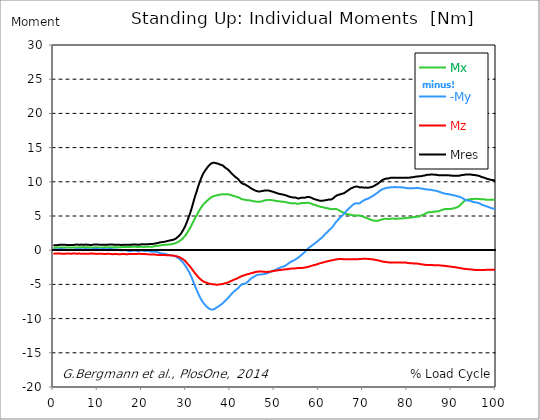
| Category |  Mx |  -My |  Mz |  Mres |
|---|---|---|---|---|
| 0.0 | 0.37 | 0.1 | -0.51 | 0.75 |
| 0.167348456675344 | 0.36 | 0.09 | -0.5 | 0.74 |
| 0.334696913350688 | 0.36 | 0.08 | -0.5 | 0.73 |
| 0.5020453700260321 | 0.36 | 0.09 | -0.49 | 0.73 |
| 0.669393826701376 | 0.37 | 0.1 | -0.48 | 0.73 |
| 0.83674228337672 | 0.38 | 0.12 | -0.48 | 0.74 |
| 1.0040907400520642 | 0.38 | 0.12 | -0.49 | 0.75 |
| 1.1621420602454444 | 0.39 | 0.12 | -0.48 | 0.76 |
| 1.3294905169207885 | 0.4 | 0.14 | -0.48 | 0.78 |
| 1.4968389735961325 | 0.4 | 0.15 | -0.49 | 0.79 |
| 1.6641874302714765 | 0.4 | 0.17 | -0.5 | 0.8 |
| 1.8315358869468206 | 0.4 | 0.16 | -0.51 | 0.81 |
| 1.9988843436221646 | 0.4 | 0.15 | -0.51 | 0.81 |
| 2.1662328002975086 | 0.4 | 0.15 | -0.51 | 0.81 |
| 2.333581256972853 | 0.4 | 0.15 | -0.51 | 0.8 |
| 2.5009297136481967 | 0.4 | 0.13 | -0.52 | 0.8 |
| 2.6682781703235405 | 0.39 | 0.1 | -0.52 | 0.79 |
| 2.8356266269988843 | 0.39 | 0.07 | -0.51 | 0.78 |
| 3.002975083674229 | 0.39 | 0.06 | -0.5 | 0.77 |
| 3.1703235403495724 | 0.39 | 0.06 | -0.49 | 0.76 |
| 3.337671997024917 | 0.39 | 0.07 | -0.49 | 0.75 |
| 3.4957233172182973 | 0.39 | 0.07 | -0.49 | 0.76 |
| 3.663071773893641 | 0.39 | 0.08 | -0.5 | 0.76 |
| 3.8304202305689854 | 0.39 | 0.07 | -0.51 | 0.77 |
| 3.997768687244329 | 0.38 | 0.06 | -0.51 | 0.77 |
| 4.165117143919673 | 0.38 | 0.04 | -0.5 | 0.77 |
| 4.332465600595017 | 0.38 | 0.04 | -0.49 | 0.76 |
| 4.499814057270361 | 0.39 | 0.05 | -0.48 | 0.77 |
| 4.667162513945706 | 0.4 | 0.08 | -0.48 | 0.78 |
| 4.834510970621049 | 0.41 | 0.12 | -0.48 | 0.8 |
| 5.001859427296393 | 0.41 | 0.14 | -0.49 | 0.81 |
| 5.169207883971737 | 0.41 | 0.14 | -0.5 | 0.82 |
| 5.336556340647081 | 0.41 | 0.13 | -0.51 | 0.82 |
| 5.503904797322425 | 0.41 | 0.13 | -0.51 | 0.82 |
| 5.671253253997769 | 0.41 | 0.12 | -0.5 | 0.81 |
| 5.82930457419115 | 0.41 | 0.13 | -0.5 | 0.8 |
| 5.996653030866494 | 0.42 | 0.16 | -0.5 | 0.81 |
| 6.164001487541838 | 0.43 | 0.17 | -0.51 | 0.82 |
| 6.331349944217181 | 0.43 | 0.15 | -0.52 | 0.82 |
| 6.498698400892526 | 0.42 | 0.12 | -0.52 | 0.81 |
| 6.66604685756787 | 0.42 | 0.11 | -0.51 | 0.8 |
| 6.833395314243213 | 0.42 | 0.12 | -0.5 | 0.8 |
| 7.000743770918558 | 0.43 | 0.14 | -0.5 | 0.8 |
| 7.168092227593902 | 0.43 | 0.17 | -0.5 | 0.81 |
| 7.335440684269246 | 0.43 | 0.18 | -0.51 | 0.82 |
| 7.50278914094459 | 0.43 | 0.18 | -0.52 | 0.82 |
| 7.6701375976199335 | 0.42 | 0.15 | -0.52 | 0.81 |
| 7.837486054295278 | 0.42 | 0.13 | -0.52 | 0.79 |
| 7.995537374488658 | 0.41 | 0.12 | -0.52 | 0.79 |
| 8.162885831164003 | 0.4 | 0.11 | -0.51 | 0.77 |
| 8.330234287839346 | 0.4 | 0.1 | -0.5 | 0.76 |
| 8.49758274451469 | 0.4 | 0.12 | -0.5 | 0.77 |
| 8.664931201190035 | 0.4 | 0.14 | -0.49 | 0.77 |
| 8.832279657865378 | 0.4 | 0.15 | -0.5 | 0.79 |
| 8.999628114540721 | 0.4 | 0.17 | -0.5 | 0.81 |
| 9.166976571216066 | 0.41 | 0.2 | -0.5 | 0.82 |
| 9.334325027891412 | 0.41 | 0.22 | -0.51 | 0.84 |
| 9.501673484566755 | 0.41 | 0.22 | -0.52 | 0.85 |
| 9.669021941242098 | 0.42 | 0.22 | -0.52 | 0.85 |
| 9.836370397917442 | 0.42 | 0.21 | -0.53 | 0.85 |
| 10.003718854592787 | 0.41 | 0.18 | -0.54 | 0.84 |
| 10.17106731126813 | 0.4 | 0.15 | -0.53 | 0.82 |
| 10.329118631461512 | 0.39 | 0.13 | -0.53 | 0.8 |
| 10.496467088136853 | 0.39 | 0.13 | -0.52 | 0.79 |
| 10.663815544812199 | 0.4 | 0.14 | -0.52 | 0.78 |
| 10.831164001487544 | 0.4 | 0.15 | -0.52 | 0.79 |
| 10.998512458162887 | 0.41 | 0.17 | -0.53 | 0.8 |
| 11.16586091483823 | 0.41 | 0.17 | -0.53 | 0.81 |
| 11.333209371513574 | 0.41 | 0.17 | -0.54 | 0.81 |
| 11.50055782818892 | 0.42 | 0.16 | -0.54 | 0.81 |
| 11.667906284864264 | 0.42 | 0.16 | -0.54 | 0.81 |
| 11.835254741539607 | 0.42 | 0.15 | -0.54 | 0.81 |
| 12.00260319821495 | 0.41 | 0.14 | -0.54 | 0.8 |
| 12.169951654890292 | 0.41 | 0.14 | -0.53 | 0.8 |
| 12.337300111565641 | 0.42 | 0.16 | -0.52 | 0.8 |
| 12.504648568240984 | 0.43 | 0.18 | -0.53 | 0.82 |
| 12.662699888434362 | 0.44 | 0.2 | -0.53 | 0.83 |
| 12.830048345109708 | 0.44 | 0.21 | -0.55 | 0.84 |
| 12.997396801785053 | 0.44 | 0.2 | -0.56 | 0.85 |
| 13.164745258460396 | 0.44 | 0.18 | -0.57 | 0.85 |
| 13.33209371513574 | 0.43 | 0.15 | -0.58 | 0.84 |
| 13.499442171811083 | 0.42 | 0.11 | -0.58 | 0.82 |
| 13.666790628486426 | 0.42 | 0.09 | -0.57 | 0.8 |
| 13.834139085161771 | 0.42 | 0.09 | -0.57 | 0.79 |
| 14.001487541837117 | 0.42 | 0.09 | -0.56 | 0.78 |
| 14.16883599851246 | 0.43 | 0.09 | -0.57 | 0.78 |
| 14.336184455187803 | 0.43 | 0.09 | -0.57 | 0.79 |
| 14.503532911863147 | 0.44 | 0.07 | -0.58 | 0.79 |
| 14.670881368538492 | 0.44 | 0.05 | -0.58 | 0.79 |
| 14.828932688731873 | 0.44 | 0.03 | -0.58 | 0.79 |
| 14.996281145407215 | 0.44 | 0.01 | -0.59 | 0.79 |
| 15.163629602082558 | 0.44 | -0.01 | -0.58 | 0.78 |
| 15.330978058757903 | 0.44 | -0.03 | -0.57 | 0.77 |
| 15.498326515433247 | 0.45 | -0.03 | -0.56 | 0.77 |
| 15.665674972108594 | 0.46 | -0.02 | -0.55 | 0.78 |
| 15.833023428783937 | 0.47 | 0 | -0.55 | 0.79 |
| 16.00037188545928 | 0.48 | 0.02 | -0.56 | 0.8 |
| 16.167720342134626 | 0.47 | 0.01 | -0.57 | 0.81 |
| 16.335068798809967 | 0.47 | -0.01 | -0.58 | 0.81 |
| 16.502417255485312 | 0.46 | -0.04 | -0.58 | 0.81 |
| 16.669765712160658 | 0.46 | -0.05 | -0.59 | 0.81 |
| 16.837114168836 | 0.46 | -0.09 | -0.58 | 0.81 |
| 17.004462625511344 | 0.46 | -0.12 | -0.57 | 0.8 |
| 17.16251394570472 | 0.46 | -0.14 | -0.56 | 0.8 |
| 17.32986240238007 | 0.46 | -0.15 | -0.55 | 0.8 |
| 17.497210859055414 | 0.47 | -0.13 | -0.54 | 0.8 |
| 17.664559315730756 | 0.49 | -0.1 | -0.54 | 0.81 |
| 17.8319077724061 | 0.5 | -0.07 | -0.54 | 0.82 |
| 17.999256229081443 | 0.51 | -0.04 | -0.54 | 0.83 |
| 18.166604685756788 | 0.51 | -0.04 | -0.55 | 0.83 |
| 18.333953142432133 | 0.51 | -0.05 | -0.56 | 0.84 |
| 18.501301599107478 | 0.5 | -0.07 | -0.56 | 0.84 |
| 18.668650055782823 | 0.49 | -0.1 | -0.56 | 0.83 |
| 18.835998512458165 | 0.48 | -0.12 | -0.55 | 0.82 |
| 19.00334696913351 | 0.47 | -0.14 | -0.54 | 0.81 |
| 19.170695425808855 | 0.47 | -0.14 | -0.52 | 0.81 |
| 19.338043882484197 | 0.48 | -0.12 | -0.52 | 0.81 |
| 19.496095202677576 | 0.48 | -0.09 | -0.52 | 0.82 |
| 19.66344365935292 | 0.49 | -0.06 | -0.53 | 0.83 |
| 19.830792116028263 | 0.49 | -0.04 | -0.54 | 0.84 |
| 19.998140572703612 | 0.49 | -0.05 | -0.55 | 0.86 |
| 20.165489029378953 | 0.49 | -0.06 | -0.57 | 0.86 |
| 20.3328374860543 | 0.48 | -0.08 | -0.57 | 0.86 |
| 20.500185942729644 | 0.48 | -0.1 | -0.57 | 0.85 |
| 20.667534399404985 | 0.48 | -0.12 | -0.57 | 0.85 |
| 20.83488285608033 | 0.48 | -0.11 | -0.57 | 0.85 |
| 21.002231312755672 | 0.49 | -0.1 | -0.58 | 0.86 |
| 21.16957976943102 | 0.49 | -0.09 | -0.59 | 0.87 |
| 21.336928226106362 | 0.49 | -0.09 | -0.6 | 0.87 |
| 21.504276682781704 | 0.49 | -0.11 | -0.61 | 0.88 |
| 21.67162513945705 | 0.49 | -0.14 | -0.61 | 0.89 |
| 21.82967645965043 | 0.5 | -0.16 | -0.62 | 0.91 |
| 21.997024916325774 | 0.5 | -0.19 | -0.62 | 0.91 |
| 22.16437337300112 | 0.5 | -0.21 | -0.62 | 0.91 |
| 22.33172182967646 | 0.51 | -0.23 | -0.61 | 0.91 |
| 22.499070286351806 | 0.53 | -0.22 | -0.62 | 0.92 |
| 22.666418743027148 | 0.55 | -0.22 | -0.62 | 0.94 |
| 22.833767199702496 | 0.57 | -0.21 | -0.62 | 0.96 |
| 23.00111565637784 | 0.59 | -0.21 | -0.63 | 0.97 |
| 23.168464113053183 | 0.61 | -0.21 | -0.65 | 0.99 |
| 23.335812569728528 | 0.62 | -0.23 | -0.67 | 1.02 |
| 23.50316102640387 | 0.64 | -0.26 | -0.68 | 1.04 |
| 23.670509483079215 | 0.65 | -0.31 | -0.69 | 1.06 |
| 23.83785793975456 | 0.67 | -0.37 | -0.7 | 1.09 |
| 23.995909259947936 | 0.69 | -0.4 | -0.7 | 1.12 |
| 24.163257716623285 | 0.71 | -0.44 | -0.71 | 1.15 |
| 24.330606173298627 | 0.72 | -0.46 | -0.71 | 1.16 |
| 24.49795462997397 | 0.73 | -0.47 | -0.71 | 1.18 |
| 24.665303086649313 | 0.75 | -0.49 | -0.71 | 1.2 |
| 24.83265154332466 | 0.75 | -0.5 | -0.71 | 1.21 |
| 25.0 | 0.76 | -0.51 | -0.71 | 1.22 |
| 25.167348456675345 | 0.77 | -0.53 | -0.72 | 1.24 |
| 25.334696913350694 | 0.78 | -0.55 | -0.72 | 1.26 |
| 25.502045370026035 | 0.8 | -0.6 | -0.73 | 1.3 |
| 25.669393826701377 | 0.81 | -0.62 | -0.73 | 1.32 |
| 25.836742283376722 | 0.82 | -0.65 | -0.74 | 1.35 |
| 26.004090740052067 | 0.83 | -0.68 | -0.74 | 1.37 |
| 26.17143919672741 | 0.84 | -0.7 | -0.75 | 1.4 |
| 26.329490516920792 | 0.85 | -0.73 | -0.75 | 1.42 |
| 26.49683897359613 | 0.87 | -0.75 | -0.76 | 1.44 |
| 26.66418743027148 | 0.88 | -0.76 | -0.76 | 1.47 |
| 26.831535886946828 | 0.9 | -0.77 | -0.77 | 1.49 |
| 26.998884343622166 | 0.92 | -0.79 | -0.78 | 1.51 |
| 27.166232800297514 | 0.94 | -0.81 | -0.8 | 1.54 |
| 27.333581256972852 | 0.97 | -0.83 | -0.82 | 1.58 |
| 27.5009297136482 | 0.99 | -0.85 | -0.83 | 1.62 |
| 27.668278170323543 | 1.04 | -0.91 | -0.86 | 1.69 |
| 27.835626626998888 | 1.1 | -0.99 | -0.89 | 1.78 |
| 28.002975083674233 | 1.15 | -1.07 | -0.91 | 1.87 |
| 28.170323540349575 | 1.2 | -1.14 | -0.95 | 1.96 |
| 28.33767199702492 | 1.25 | -1.2 | -0.98 | 2.04 |
| 28.50502045370026 | 1.32 | -1.28 | -1.02 | 2.15 |
| 28.663071773893645 | 1.4 | -1.36 | -1.07 | 2.27 |
| 28.830420230568986 | 1.47 | -1.46 | -1.13 | 2.41 |
| 28.99776868724433 | 1.57 | -1.58 | -1.19 | 2.57 |
| 29.165117143919673 | 1.67 | -1.71 | -1.27 | 2.76 |
| 29.33246560059502 | 1.78 | -1.83 | -1.33 | 2.94 |
| 29.499814057270367 | 1.89 | -1.97 | -1.41 | 3.13 |
| 29.66716251394571 | 2.01 | -2.11 | -1.5 | 3.34 |
| 29.834510970621054 | 2.15 | -2.26 | -1.6 | 3.56 |
| 30.00185942729639 | 2.3 | -2.43 | -1.72 | 3.82 |
| 30.169207883971744 | 2.46 | -2.6 | -1.83 | 4.08 |
| 30.33655634064708 | 2.64 | -2.8 | -1.97 | 4.38 |
| 30.50390479732243 | 2.82 | -2.97 | -2.09 | 4.66 |
| 30.671253253997772 | 2.99 | -3.16 | -2.21 | 4.96 |
| 30.829304574191156 | 3.17 | -3.36 | -2.34 | 5.25 |
| 30.996653030866494 | 3.35 | -3.61 | -2.47 | 5.58 |
| 31.164001487541842 | 3.55 | -3.83 | -2.61 | 5.91 |
| 31.331349944217187 | 3.76 | -4.09 | -2.75 | 6.27 |
| 31.498698400892525 | 3.99 | -4.37 | -2.9 | 6.66 |
| 31.666046857567874 | 4.21 | -4.65 | -3.05 | 7.04 |
| 31.833395314243212 | 4.44 | -4.93 | -3.2 | 7.43 |
| 32.00074377091856 | 4.64 | -5.19 | -3.35 | 7.79 |
| 32.1680922275939 | 4.85 | -5.47 | -3.48 | 8.15 |
| 32.33544068426925 | 5 | -5.69 | -3.59 | 8.44 |
| 32.50278914094459 | 5.22 | -5.94 | -3.72 | 8.8 |
| 32.670137597619934 | 5.44 | -6.2 | -3.86 | 9.16 |
| 32.83748605429528 | 5.63 | -6.45 | -3.98 | 9.5 |
| 33.004834510970625 | 5.81 | -6.67 | -4.09 | 9.8 |
| 33.162885831164004 | 5.98 | -6.89 | -4.18 | 10.09 |
| 33.33023428783935 | 6.16 | -7.11 | -4.28 | 10.38 |
| 33.497582744514695 | 6.31 | -7.28 | -4.36 | 10.63 |
| 33.664931201190036 | 6.48 | -7.46 | -4.45 | 10.89 |
| 33.83227965786538 | 6.64 | -7.62 | -4.53 | 11.13 |
| 33.99962811454073 | 6.76 | -7.76 | -4.59 | 11.33 |
| 34.16697657121607 | 6.86 | -7.9 | -4.64 | 11.49 |
| 34.33432502789141 | 6.96 | -8.02 | -4.68 | 11.65 |
| 34.50167348456676 | 7.06 | -8.14 | -4.72 | 11.81 |
| 34.6690219412421 | 7.16 | -8.25 | -4.77 | 11.97 |
| 34.83637039791744 | 7.27 | -8.35 | -4.8 | 12.11 |
| 35.00371885459279 | 7.36 | -8.44 | -4.84 | 12.25 |
| 35.17106731126814 | 7.46 | -8.52 | -4.87 | 12.37 |
| 35.338415767943474 | 7.55 | -8.58 | -4.9 | 12.48 |
| 35.49646708813686 | 7.63 | -8.63 | -4.93 | 12.58 |
| 35.6638155448122 | 7.71 | -8.67 | -4.95 | 12.66 |
| 35.831164001487544 | 7.78 | -8.69 | -4.97 | 12.73 |
| 35.998512458162885 | 7.83 | -8.69 | -4.98 | 12.76 |
| 36.165860914838234 | 7.88 | -8.66 | -4.99 | 12.77 |
| 36.333209371513576 | 7.93 | -8.64 | -5 | 12.79 |
| 36.50055782818892 | 7.96 | -8.59 | -5 | 12.78 |
| 36.667906284864266 | 7.98 | -8.51 | -5.03 | 12.75 |
| 36.83525474153961 | 8 | -8.41 | -5.04 | 12.71 |
| 37.002603198214956 | 8.03 | -8.34 | -5.04 | 12.68 |
| 37.1699516548903 | 8.06 | -8.29 | -5.04 | 12.67 |
| 37.337300111565646 | 8.09 | -8.22 | -5.03 | 12.64 |
| 37.50464856824098 | 8.11 | -8.15 | -5.02 | 12.6 |
| 37.66269988843437 | 8.11 | -8.05 | -4.99 | 12.52 |
| 37.83004834510971 | 8.13 | -7.96 | -4.97 | 12.47 |
| 37.99739680178505 | 8.16 | -7.9 | -4.97 | 12.46 |
| 38.16474525846039 | 8.19 | -7.85 | -4.95 | 12.44 |
| 38.33209371513574 | 8.19 | -7.77 | -4.93 | 12.38 |
| 38.49944217181109 | 8.17 | -7.62 | -4.89 | 12.26 |
| 38.666790628486424 | 8.16 | -7.51 | -4.86 | 12.17 |
| 38.83413908516178 | 8.16 | -7.4 | -4.83 | 12.08 |
| 39.001487541837115 | 8.16 | -7.29 | -4.8 | 12 |
| 39.16883599851246 | 8.17 | -7.19 | -4.77 | 11.93 |
| 39.336184455187805 | 8.17 | -7.08 | -4.75 | 11.86 |
| 39.503532911863154 | 8.18 | -6.97 | -4.72 | 11.79 |
| 39.670881368538495 | 8.16 | -6.85 | -4.67 | 11.68 |
| 39.83822982521384 | 8.11 | -6.74 | -4.61 | 11.55 |
| 39.996281145407224 | 8.08 | -6.61 | -4.56 | 11.43 |
| 40.163629602082565 | 8.05 | -6.47 | -4.51 | 11.31 |
| 40.33097805875791 | 8.02 | -6.36 | -4.46 | 11.2 |
| 40.498326515433256 | 7.99 | -6.25 | -4.41 | 11.1 |
| 40.6656749721086 | 7.95 | -6.15 | -4.36 | 10.99 |
| 40.83302342878393 | 7.92 | -6.05 | -4.32 | 10.89 |
| 41.00037188545929 | 7.88 | -5.95 | -4.27 | 10.79 |
| 41.16772034213463 | 7.85 | -5.85 | -4.23 | 10.7 |
| 41.33506879880997 | 7.83 | -5.77 | -4.18 | 10.62 |
| 41.50241725548531 | 7.8 | -5.7 | -4.14 | 10.55 |
| 41.66976571216066 | 7.77 | -5.63 | -4.1 | 10.47 |
| 41.837114168836 | 7.74 | -5.53 | -4.05 | 10.37 |
| 42.004462625511344 | 7.68 | -5.38 | -3.99 | 10.22 |
| 42.17181108218669 | 7.62 | -5.25 | -3.92 | 10.08 |
| 42.32986240238007 | 7.55 | -5.14 | -3.86 | 9.95 |
| 42.497210859055414 | 7.49 | -5.03 | -3.8 | 9.83 |
| 42.66455931573076 | 7.46 | -4.99 | -3.77 | 9.78 |
| 42.831907772406105 | 7.42 | -4.93 | -3.72 | 9.7 |
| 42.999256229081446 | 7.41 | -4.9 | -3.69 | 9.66 |
| 43.16660468575679 | 7.41 | -4.9 | -3.66 | 9.65 |
| 43.33395314243214 | 7.4 | -4.89 | -3.64 | 9.63 |
| 43.50130159910748 | 7.34 | -4.84 | -3.58 | 9.54 |
| 43.66865005578282 | 7.32 | -4.77 | -3.55 | 9.47 |
| 43.83599851245817 | 7.31 | -4.69 | -3.52 | 9.42 |
| 44.00334696913351 | 7.31 | -4.6 | -3.5 | 9.37 |
| 44.17069542580886 | 7.31 | -4.48 | -3.48 | 9.3 |
| 44.3380438824842 | 7.29 | -4.36 | -3.44 | 9.21 |
| 44.49609520267758 | 7.27 | -4.24 | -3.41 | 9.13 |
| 44.66344365935292 | 7.25 | -4.15 | -3.38 | 9.06 |
| 44.83079211602827 | 7.23 | -4.07 | -3.35 | 9 |
| 44.99814057270361 | 7.21 | -4 | -3.32 | 8.94 |
| 45.16548902937895 | 7.18 | -3.94 | -3.29 | 8.88 |
| 45.332837486054295 | 7.17 | -3.91 | -3.26 | 8.84 |
| 45.500185942729644 | 7.12 | -3.82 | -3.21 | 8.75 |
| 45.66753439940499 | 7.12 | -3.74 | -3.19 | 8.71 |
| 45.83488285608033 | 7.11 | -3.68 | -3.17 | 8.68 |
| 46.00223131275568 | 7.11 | -3.63 | -3.16 | 8.64 |
| 46.16957976943102 | 7.08 | -3.61 | -3.14 | 8.61 |
| 46.336928226106366 | 7.07 | -3.58 | -3.12 | 8.59 |
| 46.50427668278171 | 7.08 | -3.57 | -3.11 | 8.58 |
| 46.671625139457056 | 7.09 | -3.56 | -3.11 | 8.59 |
| 46.829676459650436 | 7.1 | -3.55 | -3.11 | 8.59 |
| 46.99702491632577 | 7.13 | -3.54 | -3.12 | 8.62 |
| 47.16437337300112 | 7.16 | -3.53 | -3.12 | 8.64 |
| 47.33172182967646 | 7.2 | -3.52 | -3.13 | 8.67 |
| 47.49907028635181 | 7.22 | -3.51 | -3.14 | 8.69 |
| 47.66641874302716 | 7.25 | -3.49 | -3.15 | 8.71 |
| 47.83376719970249 | 7.29 | -3.47 | -3.16 | 8.73 |
| 48.001115656377834 | 7.31 | -3.44 | -3.17 | 8.74 |
| 48.16846411305319 | 7.33 | -3.4 | -3.17 | 8.74 |
| 48.33581256972853 | 7.34 | -3.36 | -3.17 | 8.73 |
| 48.50316102640387 | 7.35 | -3.33 | -3.16 | 8.73 |
| 48.67050948307921 | 7.36 | -3.29 | -3.16 | 8.72 |
| 48.837857939754564 | 7.36 | -3.25 | -3.15 | 8.7 |
| 49.005206396429905 | 7.34 | -3.21 | -3.13 | 8.67 |
| 49.163257716623285 | 7.33 | -3.16 | -3.11 | 8.64 |
| 49.33060617329863 | 7.32 | -3.1 | -3.09 | 8.6 |
| 49.49795462997397 | 7.31 | -3.05 | -3.08 | 8.57 |
| 49.66530308664932 | 7.29 | -3.01 | -3.06 | 8.54 |
| 49.832651543324666 | 7.27 | -2.98 | -3.04 | 8.51 |
| 50.0 | 7.25 | -2.93 | -3.03 | 8.47 |
| 50.16734845667534 | 7.23 | -2.88 | -3.01 | 8.43 |
| 50.33469691335069 | 7.21 | -2.84 | -2.98 | 8.39 |
| 50.50204537002604 | 7.19 | -2.78 | -2.97 | 8.35 |
| 50.66939382670139 | 7.17 | -2.72 | -2.95 | 8.31 |
| 50.836742283376715 | 7.15 | -2.67 | -2.93 | 8.28 |
| 51.00409074005207 | 7.14 | -2.62 | -2.91 | 8.25 |
| 51.17143919672741 | 7.14 | -2.58 | -2.9 | 8.24 |
| 51.32949051692079 | 7.13 | -2.54 | -2.89 | 8.21 |
| 51.496838973596134 | 7.11 | -2.49 | -2.87 | 8.18 |
| 51.66418743027148 | 7.09 | -2.45 | -2.86 | 8.16 |
| 51.831535886946824 | 7.08 | -2.44 | -2.85 | 8.14 |
| 51.99888434362217 | 7.09 | -2.4 | -2.84 | 8.13 |
| 52.16623280029752 | 7.07 | -2.36 | -2.83 | 8.1 |
| 52.33358125697285 | 7.04 | -2.3 | -2.81 | 8.05 |
| 52.5009297136482 | 7.03 | -2.23 | -2.8 | 8.03 |
| 52.668278170323546 | 7.01 | -2.15 | -2.79 | 8 |
| 52.835626626998895 | 6.98 | -2.09 | -2.78 | 7.95 |
| 53.00297508367424 | 6.95 | -2.01 | -2.76 | 7.91 |
| 53.17032354034958 | 6.93 | -1.93 | -2.74 | 7.88 |
| 53.33767199702492 | 6.9 | -1.85 | -2.72 | 7.83 |
| 53.50502045370027 | 6.88 | -1.78 | -2.71 | 7.8 |
| 53.663071773893655 | 6.87 | -1.72 | -2.7 | 7.77 |
| 53.83042023056899 | 6.86 | -1.66 | -2.69 | 7.75 |
| 53.99776868724433 | 6.85 | -1.6 | -2.68 | 7.73 |
| 54.16511714391967 | 6.83 | -1.56 | -2.67 | 7.7 |
| 54.33246560059503 | 6.84 | -1.51 | -2.66 | 7.7 |
| 54.49981405727037 | 6.86 | -1.44 | -2.66 | 7.71 |
| 54.667162513945705 | 6.87 | -1.38 | -2.66 | 7.71 |
| 54.834510970621054 | 6.85 | -1.31 | -2.65 | 7.69 |
| 55.0018594272964 | 6.82 | -1.23 | -2.64 | 7.64 |
| 55.169207883971744 | 6.79 | -1.16 | -2.62 | 7.59 |
| 55.336556340647086 | 6.77 | -1.09 | -2.59 | 7.56 |
| 55.50390479732243 | 6.78 | -1.01 | -2.59 | 7.56 |
| 55.671253253997776 | 6.82 | -0.93 | -2.59 | 7.59 |
| 55.83860171067312 | 6.86 | -0.85 | -2.6 | 7.64 |
| 55.9966530308665 | 6.89 | -0.75 | -2.6 | 7.67 |
| 56.16400148754184 | 6.9 | -0.66 | -2.6 | 7.67 |
| 56.33134994421718 | 6.91 | -0.56 | -2.59 | 7.69 |
| 56.498698400892536 | 6.91 | -0.47 | -2.57 | 7.69 |
| 56.66604685756788 | 6.89 | -0.38 | -2.55 | 7.67 |
| 56.83339531424321 | 6.88 | -0.29 | -2.54 | 7.66 |
| 57.00074377091856 | 6.89 | -0.16 | -2.52 | 7.69 |
| 57.16809222759391 | 6.91 | -0.03 | -2.5 | 7.72 |
| 57.33544068426925 | 6.94 | 0.1 | -2.49 | 7.77 |
| 57.5027891409446 | 6.94 | 0.2 | -2.46 | 7.79 |
| 57.670137597619934 | 6.94 | 0.29 | -2.42 | 7.79 |
| 57.83748605429528 | 6.91 | 0.37 | -2.4 | 7.78 |
| 58.004834510970625 | 6.88 | 0.46 | -2.36 | 7.75 |
| 58.16288583116401 | 6.84 | 0.55 | -2.32 | 7.72 |
| 58.330234287839346 | 6.8 | 0.62 | -2.29 | 7.67 |
| 58.497582744514695 | 6.75 | 0.7 | -2.26 | 7.63 |
| 58.66493120119004 | 6.69 | 0.78 | -2.23 | 7.56 |
| 58.832279657865385 | 6.65 | 0.86 | -2.19 | 7.51 |
| 58.999628114540734 | 6.62 | 0.93 | -2.17 | 7.47 |
| 59.16697657121607 | 6.59 | 1.01 | -2.14 | 7.43 |
| 59.33432502789142 | 6.57 | 1.09 | -2.12 | 7.4 |
| 59.50167348456676 | 6.54 | 1.19 | -2.09 | 7.37 |
| 59.66902194124211 | 6.5 | 1.28 | -2.05 | 7.35 |
| 59.83637039791745 | 6.46 | 1.37 | -2.01 | 7.32 |
| 60.00371885459278 | 6.42 | 1.46 | -1.97 | 7.28 |
| 60.17106731126813 | 6.39 | 1.54 | -1.94 | 7.25 |
| 60.33841576794349 | 6.35 | 1.64 | -1.9 | 7.22 |
| 60.49646708813685 | 6.33 | 1.73 | -1.87 | 7.23 |
| 60.6638155448122 | 6.31 | 1.81 | -1.85 | 7.23 |
| 60.831164001487544 | 6.3 | 1.9 | -1.82 | 7.23 |
| 60.99851245816289 | 6.28 | 2.02 | -1.79 | 7.25 |
| 61.16586091483824 | 6.25 | 2.15 | -1.76 | 7.26 |
| 61.333209371513576 | 6.22 | 2.27 | -1.73 | 7.28 |
| 61.50055782818892 | 6.18 | 2.37 | -1.7 | 7.3 |
| 61.667906284864266 | 6.16 | 2.48 | -1.67 | 7.33 |
| 61.835254741539615 | 6.15 | 2.58 | -1.64 | 7.34 |
| 62.002603198214956 | 6.13 | 2.68 | -1.62 | 7.36 |
| 62.16995165489029 | 6.11 | 2.81 | -1.6 | 7.4 |
| 62.33730011156564 | 6.09 | 2.93 | -1.57 | 7.42 |
| 62.504648568240995 | 6.04 | 3.01 | -1.54 | 7.38 |
| 62.67199702491633 | 6.03 | 3.1 | -1.52 | 7.39 |
| 62.83004834510971 | 6.01 | 3.19 | -1.5 | 7.41 |
| 62.99739680178505 | 6.01 | 3.31 | -1.48 | 7.46 |
| 63.1647452584604 | 6 | 3.44 | -1.45 | 7.52 |
| 63.33209371513575 | 6.01 | 3.59 | -1.43 | 7.62 |
| 63.4994421718111 | 6.02 | 3.74 | -1.4 | 7.72 |
| 63.666790628486424 | 6.03 | 3.9 | -1.38 | 7.82 |
| 63.83413908516177 | 6.03 | 4.06 | -1.36 | 7.94 |
| 64.00148754183712 | 6 | 4.18 | -1.34 | 7.98 |
| 64.16883599851248 | 5.97 | 4.29 | -1.32 | 8.01 |
| 64.3361844551878 | 5.94 | 4.41 | -1.31 | 8.07 |
| 64.50353291186315 | 5.88 | 4.53 | -1.31 | 8.11 |
| 64.6708813685385 | 5.8 | 4.65 | -1.3 | 8.13 |
| 64.83822982521384 | 5.74 | 4.78 | -1.3 | 8.19 |
| 65.00557828188919 | 5.68 | 4.87 | -1.3 | 8.2 |
| 65.16362960208257 | 5.61 | 4.97 | -1.3 | 8.22 |
| 65.3309780587579 | 5.57 | 5.09 | -1.3 | 8.26 |
| 65.49832651543326 | 5.52 | 5.19 | -1.31 | 8.3 |
| 65.6656749721086 | 5.46 | 5.31 | -1.31 | 8.33 |
| 65.83302342878395 | 5.41 | 5.42 | -1.31 | 8.38 |
| 66.00037188545929 | 5.35 | 5.54 | -1.31 | 8.45 |
| 66.16772034213463 | 5.31 | 5.65 | -1.32 | 8.52 |
| 66.33506879880998 | 5.28 | 5.8 | -1.32 | 8.62 |
| 66.50241725548531 | 5.26 | 5.91 | -1.33 | 8.69 |
| 66.66976571216065 | 5.23 | 6 | -1.33 | 8.75 |
| 66.83711416883601 | 5.21 | 6.11 | -1.34 | 8.82 |
| 67.00446262551135 | 5.19 | 6.21 | -1.34 | 8.91 |
| 67.1718110821867 | 5.18 | 6.31 | -1.34 | 8.99 |
| 67.32986240238007 | 5.16 | 6.41 | -1.34 | 9.06 |
| 67.49721085905541 | 5.14 | 6.49 | -1.33 | 9.08 |
| 67.66455931573076 | 5.12 | 6.6 | -1.33 | 9.13 |
| 67.83190777240611 | 5.1 | 6.7 | -1.33 | 9.18 |
| 67.99925622908145 | 5.09 | 6.77 | -1.33 | 9.24 |
| 68.16660468575678 | 5.08 | 6.81 | -1.33 | 9.26 |
| 68.33395314243214 | 5.07 | 6.84 | -1.33 | 9.29 |
| 68.50130159910749 | 5.07 | 6.87 | -1.32 | 9.31 |
| 68.66865005578282 | 5.07 | 6.87 | -1.32 | 9.31 |
| 68.83599851245816 | 5.09 | 6.84 | -1.32 | 9.29 |
| 69.00334696913352 | 5.09 | 6.82 | -1.31 | 9.25 |
| 69.17069542580886 | 5.08 | 6.8 | -1.3 | 9.2 |
| 69.3380438824842 | 5.05 | 6.88 | -1.27 | 9.16 |
| 69.50539233915956 | 5.02 | 7 | -1.26 | 9.19 |
| 69.66344365935292 | 4.99 | 7.07 | -1.27 | 9.21 |
| 69.83079211602826 | 4.96 | 7.15 | -1.25 | 9.19 |
| 69.99814057270362 | 4.92 | 7.21 | -1.24 | 9.17 |
| 70.16548902937896 | 4.88 | 7.28 | -1.23 | 9.16 |
| 70.33283748605429 | 4.83 | 7.34 | -1.24 | 9.14 |
| 70.50018594272964 | 4.79 | 7.39 | -1.25 | 9.15 |
| 70.667534399405 | 4.75 | 7.44 | -1.26 | 9.16 |
| 70.83488285608033 | 4.71 | 7.47 | -1.27 | 9.15 |
| 71.00223131275568 | 4.67 | 7.51 | -1.27 | 9.14 |
| 71.16957976943102 | 4.63 | 7.54 | -1.28 | 9.14 |
| 71.33692822610637 | 4.58 | 7.58 | -1.29 | 9.15 |
| 71.50427668278171 | 4.53 | 7.65 | -1.3 | 9.17 |
| 71.67162513945706 | 4.49 | 7.72 | -1.31 | 9.2 |
| 71.8389735961324 | 4.45 | 7.78 | -1.31 | 9.22 |
| 71.99702491632577 | 4.41 | 7.84 | -1.32 | 9.25 |
| 72.16437337300113 | 4.37 | 7.9 | -1.34 | 9.29 |
| 72.33172182967647 | 4.34 | 7.98 | -1.35 | 9.34 |
| 72.49907028635181 | 4.32 | 8.05 | -1.37 | 9.39 |
| 72.66641874302715 | 4.3 | 8.12 | -1.39 | 9.45 |
| 72.8337671997025 | 4.29 | 8.2 | -1.41 | 9.51 |
| 73.00111565637783 | 4.3 | 8.28 | -1.44 | 9.58 |
| 73.16846411305319 | 4.3 | 8.35 | -1.46 | 9.64 |
| 73.33581256972853 | 4.3 | 8.42 | -1.48 | 9.7 |
| 73.50316102640387 | 4.32 | 8.51 | -1.49 | 9.79 |
| 73.67050948307921 | 4.35 | 8.61 | -1.52 | 9.88 |
| 73.83785793975457 | 4.41 | 8.7 | -1.56 | 9.99 |
| 74.00520639642991 | 4.44 | 8.77 | -1.57 | 10.07 |
| 74.16325771662328 | 4.48 | 8.84 | -1.62 | 10.16 |
| 74.33060617329863 | 4.51 | 8.89 | -1.65 | 10.23 |
| 74.49795462997398 | 4.52 | 8.93 | -1.67 | 10.27 |
| 74.66530308664932 | 4.55 | 8.98 | -1.68 | 10.34 |
| 74.83265154332466 | 4.58 | 9.02 | -1.7 | 10.39 |
| 75.00000000000001 | 4.59 | 9.05 | -1.72 | 10.42 |
| 75.16734845667534 | 4.6 | 9.1 | -1.73 | 10.47 |
| 75.3346969133507 | 4.6 | 9.11 | -1.74 | 10.48 |
| 75.50204537002605 | 4.57 | 9.11 | -1.76 | 10.48 |
| 75.66939382670138 | 4.56 | 9.12 | -1.77 | 10.48 |
| 75.83674228337672 | 4.57 | 9.14 | -1.78 | 10.51 |
| 76.00409074005208 | 4.57 | 9.17 | -1.79 | 10.54 |
| 76.17143919672742 | 4.59 | 9.2 | -1.79 | 10.58 |
| 76.33878765340276 | 4.61 | 9.22 | -1.79 | 10.6 |
| 76.49683897359614 | 4.62 | 9.21 | -1.79 | 10.6 |
| 76.66418743027148 | 4.63 | 9.2 | -1.79 | 10.6 |
| 76.83153588694682 | 4.62 | 9.21 | -1.8 | 10.6 |
| 76.99888434362218 | 4.61 | 9.22 | -1.81 | 10.61 |
| 77.16623280029752 | 4.61 | 9.23 | -1.81 | 10.61 |
| 77.33358125697285 | 4.6 | 9.23 | -1.81 | 10.61 |
| 77.5009297136482 | 4.6 | 9.23 | -1.81 | 10.61 |
| 77.66827817032356 | 4.6 | 9.21 | -1.81 | 10.6 |
| 77.83562662699889 | 4.61 | 9.2 | -1.8 | 10.59 |
| 78.00297508367423 | 4.61 | 9.2 | -1.8 | 10.6 |
| 78.17032354034959 | 4.62 | 9.21 | -1.8 | 10.6 |
| 78.33767199702493 | 4.63 | 9.19 | -1.79 | 10.6 |
| 78.50502045370027 | 4.63 | 9.19 | -1.79 | 10.59 |
| 78.67236891037561 | 4.63 | 9.19 | -1.8 | 10.6 |
| 78.83042023056899 | 4.64 | 9.18 | -1.81 | 10.6 |
| 78.99776868724433 | 4.67 | 9.17 | -1.82 | 10.61 |
| 79.16511714391969 | 4.68 | 9.15 | -1.83 | 10.61 |
| 79.33246560059503 | 4.68 | 9.14 | -1.8 | 10.59 |
| 79.49981405727036 | 4.69 | 9.12 | -1.8 | 10.59 |
| 79.66716251394571 | 4.71 | 9.1 | -1.81 | 10.59 |
| 79.83451097062107 | 4.72 | 9.09 | -1.83 | 10.6 |
| 80.00185942729641 | 4.73 | 9.07 | -1.85 | 10.6 |
| 80.16920788397174 | 4.74 | 9.05 | -1.87 | 10.59 |
| 80.33655634064709 | 4.75 | 9.04 | -1.88 | 10.6 |
| 80.50390479732243 | 4.75 | 9.04 | -1.88 | 10.61 |
| 80.67125325399778 | 4.78 | 9.04 | -1.9 | 10.62 |
| 80.83860171067312 | 4.79 | 9.05 | -1.91 | 10.64 |
| 80.99665303086651 | 4.8 | 9.06 | -1.91 | 10.66 |
| 81.16400148754184 | 4.8 | 9.05 | -1.92 | 10.66 |
| 81.3313499442172 | 4.81 | 9.05 | -1.93 | 10.67 |
| 81.49869840089255 | 4.84 | 9.05 | -1.94 | 10.69 |
| 81.66604685756786 | 4.86 | 9.07 | -1.94 | 10.72 |
| 81.83339531424322 | 4.87 | 9.09 | -1.95 | 10.74 |
| 82.00074377091858 | 4.88 | 9.1 | -1.95 | 10.76 |
| 82.16809222759392 | 4.88 | 9.11 | -1.95 | 10.77 |
| 82.33544068426926 | 4.89 | 9.1 | -1.96 | 10.77 |
| 82.50278914094459 | 4.91 | 9.09 | -1.98 | 10.78 |
| 82.67013759761994 | 4.93 | 9.08 | -2 | 10.8 |
| 82.83748605429528 | 4.97 | 9.06 | -2.02 | 10.8 |
| 83.00483451097062 | 5 | 9.04 | -2.03 | 10.8 |
| 83.17218296764597 | 5.06 | 9.01 | -2.05 | 10.82 |
| 83.33023428783935 | 5.13 | 8.98 | -2.08 | 10.84 |
| 83.4975827445147 | 5.17 | 8.96 | -2.09 | 10.86 |
| 83.66493120119004 | 5.21 | 8.97 | -2.1 | 10.9 |
| 83.83227965786537 | 5.24 | 8.94 | -2.12 | 10.9 |
| 83.99962811454073 | 5.32 | 8.92 | -2.13 | 10.93 |
| 84.16697657121607 | 5.38 | 8.91 | -2.14 | 10.97 |
| 84.33432502789142 | 5.43 | 8.9 | -2.16 | 10.99 |
| 84.50167348456677 | 5.49 | 8.88 | -2.17 | 11.01 |
| 84.6690219412421 | 5.55 | 8.86 | -2.17 | 11.04 |
| 84.83637039791745 | 5.55 | 8.85 | -2.17 | 11.04 |
| 85.0037188545928 | 5.53 | 8.85 | -2.17 | 11.04 |
| 85.17106731126813 | 5.53 | 8.85 | -2.17 | 11.05 |
| 85.33841576794349 | 5.55 | 8.84 | -2.17 | 11.06 |
| 85.50576422461883 | 5.57 | 8.81 | -2.17 | 11.06 |
| 85.66381554481221 | 5.6 | 8.79 | -2.17 | 11.07 |
| 85.83116400148755 | 5.63 | 8.76 | -2.18 | 11.07 |
| 85.99851245816289 | 5.63 | 8.74 | -2.19 | 11.05 |
| 86.16586091483823 | 5.63 | 8.72 | -2.2 | 11.04 |
| 86.33320937151358 | 5.63 | 8.7 | -2.2 | 11.03 |
| 86.50055782818893 | 5.65 | 8.68 | -2.2 | 11.02 |
| 86.66790628486427 | 5.67 | 8.67 | -2.2 | 11.02 |
| 86.83525474153961 | 5.68 | 8.63 | -2.21 | 11 |
| 87.00260319821496 | 5.69 | 8.59 | -2.21 | 10.97 |
| 87.16995165489031 | 5.72 | 8.56 | -2.22 | 10.96 |
| 87.33730011156564 | 5.76 | 8.52 | -2.22 | 10.96 |
| 87.504648568241 | 5.8 | 8.48 | -2.23 | 10.95 |
| 87.67199702491634 | 5.83 | 8.45 | -2.24 | 10.95 |
| 87.83004834510972 | 5.87 | 8.4 | -2.25 | 10.95 |
| 87.99739680178506 | 5.91 | 8.36 | -2.26 | 10.95 |
| 88.1647452584604 | 5.95 | 8.32 | -2.27 | 10.95 |
| 88.33209371513574 | 5.98 | 8.3 | -2.28 | 10.96 |
| 88.49944217181108 | 6.01 | 8.28 | -2.29 | 10.97 |
| 88.66679062848644 | 6.02 | 8.26 | -2.3 | 10.97 |
| 88.83413908516178 | 6.02 | 8.24 | -2.32 | 10.96 |
| 89.00148754183712 | 6.03 | 8.22 | -2.33 | 10.96 |
| 89.16883599851246 | 6.03 | 8.21 | -2.35 | 10.96 |
| 89.33618445518782 | 6.02 | 8.19 | -2.36 | 10.95 |
| 89.50353291186315 | 6.01 | 8.17 | -2.37 | 10.93 |
| 89.6708813685385 | 6.01 | 8.15 | -2.39 | 10.92 |
| 89.83822982521386 | 6.04 | 8.13 | -2.4 | 10.93 |
| 90.00557828188919 | 6.06 | 8.09 | -2.42 | 10.91 |
| 90.16362960208257 | 6.07 | 8.06 | -2.43 | 10.89 |
| 90.3309780587579 | 6.09 | 8.05 | -2.45 | 10.88 |
| 90.49832651543326 | 6.12 | 8.04 | -2.46 | 10.89 |
| 90.66567497210859 | 6.15 | 8.01 | -2.47 | 10.9 |
| 90.83302342878395 | 6.18 | 7.98 | -2.49 | 10.88 |
| 91.00037188545929 | 6.21 | 7.95 | -2.51 | 10.88 |
| 91.16772034213463 | 6.25 | 7.92 | -2.53 | 10.87 |
| 91.33506879880998 | 6.29 | 7.89 | -2.54 | 10.87 |
| 91.50241725548533 | 6.35 | 7.86 | -2.57 | 10.86 |
| 91.66976571216065 | 6.4 | 7.83 | -2.58 | 10.87 |
| 91.83711416883601 | 6.49 | 7.81 | -2.6 | 10.9 |
| 92.00446262551137 | 6.6 | 7.78 | -2.62 | 10.93 |
| 92.1718110821867 | 6.73 | 7.73 | -2.64 | 10.96 |
| 92.33915953886203 | 6.83 | 7.67 | -2.66 | 10.98 |
| 92.49721085905541 | 6.92 | 7.62 | -2.68 | 10.99 |
| 92.66455931573077 | 7.01 | 7.56 | -2.7 | 11 |
| 92.83190777240611 | 7.13 | 7.48 | -2.72 | 11.02 |
| 92.99925622908145 | 7.24 | 7.4 | -2.73 | 11.04 |
| 93.1666046857568 | 7.32 | 7.33 | -2.75 | 11.05 |
| 93.33395314243214 | 7.35 | 7.31 | -2.76 | 11.06 |
| 93.50130159910749 | 7.38 | 7.29 | -2.77 | 11.06 |
| 93.66865005578283 | 7.4 | 7.27 | -2.77 | 11.07 |
| 93.83599851245818 | 7.41 | 7.26 | -2.78 | 11.07 |
| 94.00334696913353 | 7.43 | 7.24 | -2.78 | 11.08 |
| 94.17069542580886 | 7.45 | 7.24 | -2.79 | 11.09 |
| 94.3380438824842 | 7.46 | 7.2 | -2.8 | 11.07 |
| 94.50539233915954 | 7.47 | 7.15 | -2.82 | 11.04 |
| 94.66344365935292 | 7.48 | 7.11 | -2.83 | 11.03 |
| 94.83079211602828 | 7.48 | 7.08 | -2.85 | 11.01 |
| 94.99814057270362 | 7.49 | 7.04 | -2.86 | 10.99 |
| 95.16548902937897 | 7.5 | 7.02 | -2.87 | 10.97 |
| 95.33283748605432 | 7.51 | 7.01 | -2.88 | 10.98 |
| 95.50018594272963 | 7.51 | 7 | -2.88 | 10.98 |
| 95.66753439940499 | 7.51 | 6.96 | -2.89 | 10.94 |
| 95.83488285608034 | 7.5 | 6.93 | -2.89 | 10.92 |
| 96.00223131275567 | 7.5 | 6.91 | -2.89 | 10.9 |
| 96.16957976943102 | 7.49 | 6.89 | -2.88 | 10.89 |
| 96.33692822610638 | 7.47 | 6.87 | -2.88 | 10.85 |
| 96.50427668278171 | 7.46 | 6.79 | -2.89 | 10.79 |
| 96.67162513945706 | 7.46 | 6.73 | -2.9 | 10.75 |
| 96.8389735961324 | 7.46 | 6.66 | -2.9 | 10.7 |
| 96.99702491632577 | 7.46 | 6.62 | -2.91 | 10.67 |
| 97.16437337300111 | 7.45 | 6.6 | -2.91 | 10.66 |
| 97.33172182967647 | 7.43 | 6.56 | -2.9 | 10.62 |
| 97.49907028635181 | 7.42 | 6.52 | -2.89 | 10.58 |
| 97.66641874302715 | 7.41 | 6.48 | -2.88 | 10.54 |
| 97.8337671997025 | 7.39 | 6.44 | -2.87 | 10.5 |
| 98.00111565637785 | 7.38 | 6.4 | -2.86 | 10.45 |
| 98.16846411305319 | 7.37 | 6.36 | -2.85 | 10.42 |
| 98.33581256972855 | 7.37 | 6.33 | -2.84 | 10.4 |
| 98.50316102640389 | 7.37 | 6.29 | -2.84 | 10.36 |
| 98.67050948307921 | 7.36 | 6.24 | -2.85 | 10.33 |
| 98.83785793975456 | 7.36 | 6.2 | -2.85 | 10.3 |
| 99.0052063964299 | 7.37 | 6.16 | -2.85 | 10.28 |
| 99.17255485310525 | 7.37 | 6.14 | -2.86 | 10.27 |
| 99.33060617329863 | 7.38 | 6.1 | -2.85 | 10.25 |
| 99.49795462997399 | 7.39 | 6.08 | -2.85 | 10.24 |
| 99.66530308664933 | 7.41 | 6.04 | -2.85 | 10.23 |
| 99.83265154332467 | 7.42 | 6 | -2.86 | 10.22 |
| 100.0 | 7.44 | 5.96 | -2.87 | 10.21 |